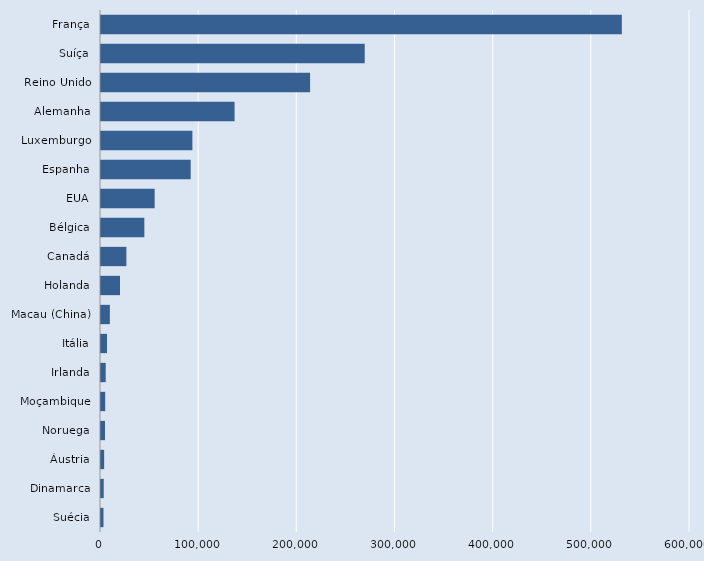
| Category | Series 0 |
|---|---|
| Suécia | 2527 |
| Dinamarca | 2780 |
| Áustria | 3213 |
| Noruega | 4094 |
| Moçambique | 4279 |
| Irlanda | 4807 |
| Itália | 6088 |
| Macau (China) | 9024 |
| Holanda | 19384 |
| Canadá | 25855 |
| Bélgica | 44166 |
| EUA | 54669 |
| Espanha | 91371 |
| Luxemburgo | 93100 |
| Alemanha | 136080 |
| Reino Unido | 213000 |
| Suíça | 268660 |
| França | 530557 |